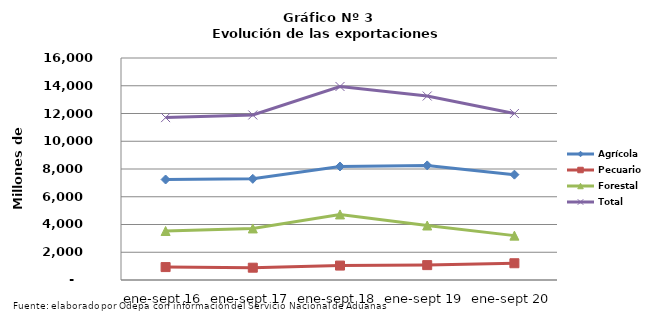
| Category | Agrícola | Pecuario | Forestal | Total |
|---|---|---|---|---|
| ene-sept 16 | 7242655 | 930928 | 3530666 | 11704249 |
| ene-sept 17 | 7291030 | 887030 | 3715359 | 11893419 |
| ene-sept 18 | 8182390 | 1039856 | 4724575 | 13946821 |
| ene-sept 19 | 8260062 | 1072502 | 3927445 | 13260009 |
| ene-sept 20 | 7592722 | 1207484 | 3198118 | 11998324 |